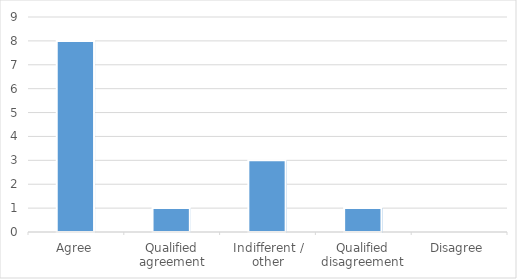
| Category | Series 0 |
|---|---|
| Agree | 8 |
| Qualified agreement | 1 |
| Indifferent / other | 3 |
| Qualified disagreement | 1 |
| Disagree | 0 |